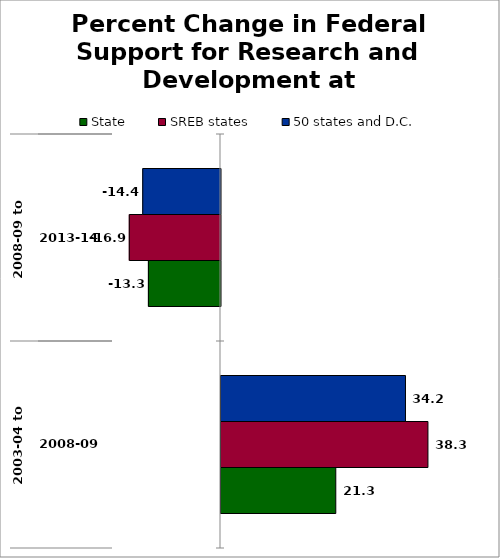
| Category | State | SREB states | 50 states and D.C. |
|---|---|---|---|
| 0 | 21.257 | 38.322 | 34.164 |
| 1 | -13.349 | -16.891 | -14.398 |